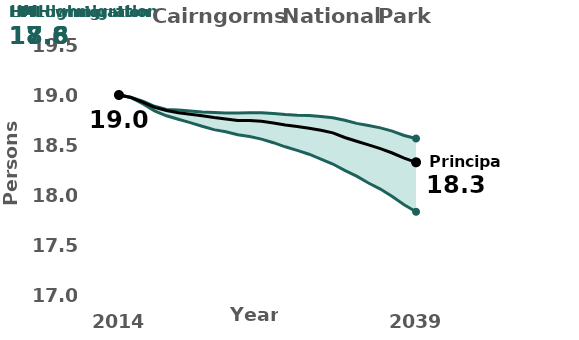
| Category |  High migration |  Low migration  |  Principal |
|---|---|---|---|
| 2014.0 | 19.01 | 19.01 | 19.01 |
| 2015.0 | 18.988 | 18.986 | 18.985 |
| 2016.0 | 18.948 | 18.923 | 18.939 |
| 2017.0 | 18.897 | 18.852 | 18.886 |
| 2018.0 | 18.866 | 18.802 | 18.855 |
| 2019.0 | 18.859 | 18.767 | 18.832 |
| 2020.0 | 18.851 | 18.734 | 18.818 |
| 2021.0 | 18.841 | 18.697 | 18.803 |
| 2022.0 | 18.835 | 18.664 | 18.785 |
| 2023.0 | 18.83 | 18.642 | 18.77 |
| 2024.0 | 18.83 | 18.613 | 18.755 |
| 2025.0 | 18.833 | 18.594 | 18.755 |
| 2026.0 | 18.832 | 18.569 | 18.748 |
| 2027.0 | 18.825 | 18.533 | 18.73 |
| 2028.0 | 18.815 | 18.492 | 18.711 |
| 2029.0 | 18.808 | 18.456 | 18.695 |
| 2030.0 | 18.806 | 18.418 | 18.678 |
| 2031.0 | 18.795 | 18.368 | 18.657 |
| 2032.0 | 18.783 | 18.32 | 18.631 |
| 2033.0 | 18.757 | 18.256 | 18.585 |
| 2034.0 | 18.726 | 18.199 | 18.548 |
| 2035.0 | 18.705 | 18.13 | 18.511 |
| 2036.0 | 18.681 | 18.069 | 18.474 |
| 2037.0 | 18.649 | 17.994 | 18.43 |
| 2038.0 | 18.605 | 17.913 | 18.379 |
| 2039.0 | 18.575 | 17.842 | 18.337 |